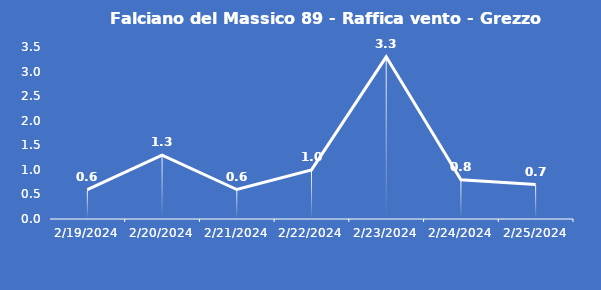
| Category | Falciano del Massico 89 - Raffica vento - Grezzo (m/s) |
|---|---|
| 2/19/24 | 0.6 |
| 2/20/24 | 1.3 |
| 2/21/24 | 0.6 |
| 2/22/24 | 1 |
| 2/23/24 | 3.3 |
| 2/24/24 | 0.8 |
| 2/25/24 | 0.7 |